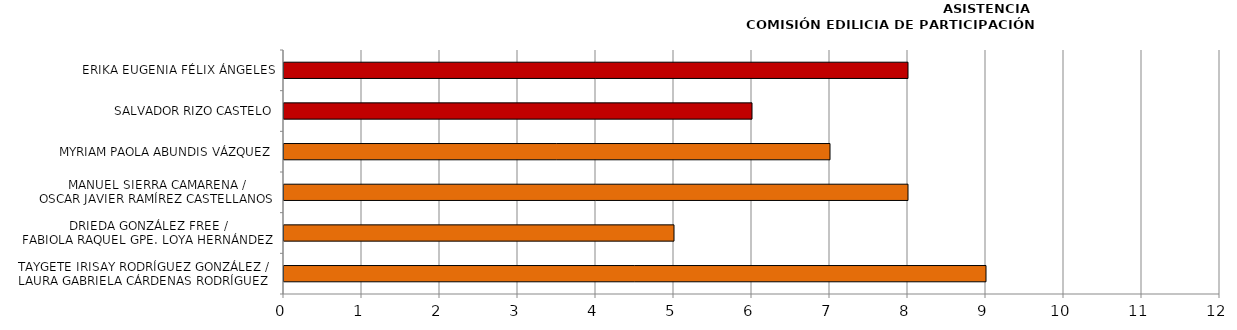
| Category | Series 0 |
|---|---|
| TAYGETE IRISAY RODRÍGUEZ GONZÁLEZ /
LAURA GABRIELA CÁRDENAS RODRÍGUEZ | 9 |
| DRIEDA GONZÁLEZ FREE /
FABIOLA RAQUEL GPE. LOYA HERNÁNDEZ | 5 |
| MANUEL SIERRA CAMARENA /
OSCAR JAVIER RAMÍREZ CASTELLANOS | 8 |
| MYRIAM PAOLA ABUNDIS VÁZQUEZ | 7 |
| SALVADOR RIZO CASTELO | 6 |
| ERIKA EUGENIA FÉLIX ÁNGELES | 8 |